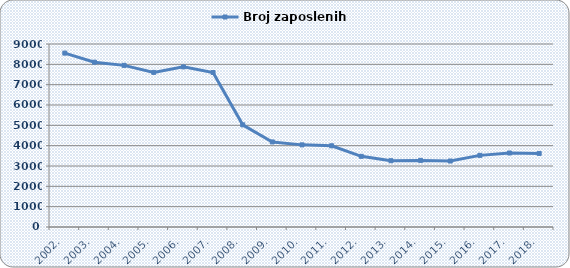
| Category | Broj zaposlenih |
|---|---|
| 2002. | 8552 |
| 2003. | 8105 |
| 2004. | 7949 |
| 2005. | 7604 |
| 2006. | 7874 |
| 2007. | 7599 |
| 2008. | 5026 |
| 2009. | 4183 |
| 2010. | 4039 |
| 2011. | 3995 |
| 2012. | 3475 |
| 2013. | 3260 |
| 2014. | 3276 |
| 2015. | 3245 |
| 2016. | 3523 |
| 2017. | 3640 |
| 2018. | 3618 |